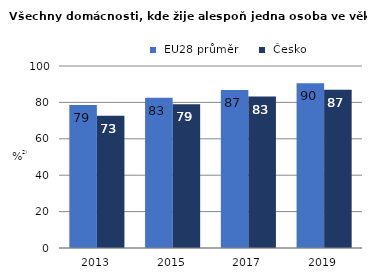
| Category |  EU28 průměr |  Česko |
|---|---|---|
| 2013.0 | 78.589 | 72.617 |
| 2015.0 | 82.596 | 78.975 |
| 2017.0 | 86.859 | 83.235 |
| 2019.0 | 90.478 | 87 |